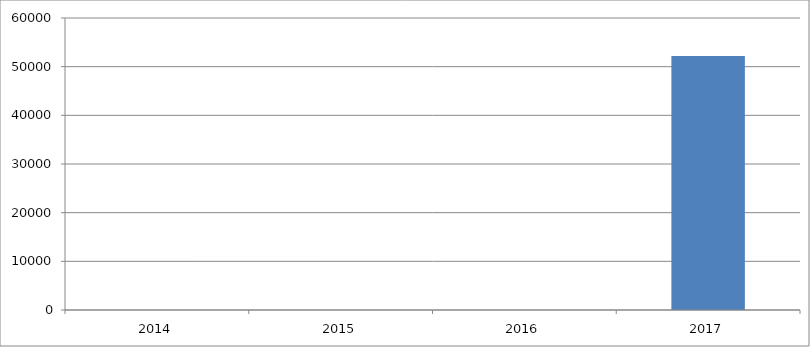
| Category | Series 0 |
|---|---|
| 2014.0 | 0 |
| 2015.0 | 0 |
| 2016.0 | 0 |
| 2017.0 | 52193 |